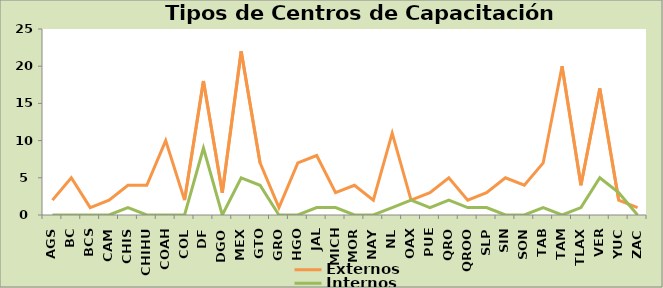
| Category | Externos | Internos |
|---|---|---|
| AGS | 2 | 0 |
| BC | 5 | 0 |
| BCS | 1 | 0 |
| CAM | 2 | 0 |
| CHIS | 4 | 1 |
| CHIHU | 4 | 0 |
| COAH | 10 | 0 |
| COL | 2 | 0 |
| DF | 18 | 9 |
| DGO | 3 | 0 |
| MEX | 22 | 5 |
| GTO | 7 | 4 |
| GRO | 1 | 0 |
| HGO | 7 | 0 |
| JAL | 8 | 1 |
| MICH | 3 | 1 |
| MOR | 4 | 0 |
| NAY | 2 | 0 |
| NL | 11 | 1 |
| OAX | 2 | 2 |
| PUE | 3 | 1 |
| QRO | 5 | 2 |
| QROO | 2 | 1 |
| SLP | 3 | 1 |
| SIN | 5 | 0 |
| SON | 4 | 0 |
| TAB | 7 | 1 |
| TAM | 20 | 0 |
| TLAX | 4 | 1 |
| VER | 17 | 5 |
| YUC | 2 | 3 |
| ZAC | 1 | 0 |